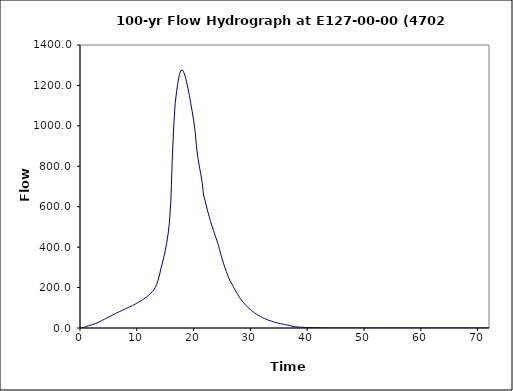
| Category | Series 0 |
|---|---|
| 0.0 | 0 |
| 0.25 | 0.4 |
| 0.5 | 1.7 |
| 0.75 | 4 |
| 1.0 | 6.5 |
| 1.25 | 9 |
| 1.5 | 11.3 |
| 1.75 | 13.4 |
| 2.0 | 15.5 |
| 2.25 | 17.5 |
| 2.5 | 19.7 |
| 2.75 | 22.2 |
| 3.0 | 25.2 |
| 3.25 | 28.4 |
| 3.5 | 31.8 |
| 3.75 | 35.4 |
| 4.0 | 39 |
| 4.25 | 42.7 |
| 4.5 | 46.4 |
| 4.75 | 50 |
| 5.0 | 53.7 |
| 5.25 | 57.3 |
| 5.5 | 60.9 |
| 5.75 | 64.5 |
| 6.0 | 68 |
| 6.25 | 71.5 |
| 6.5 | 75 |
| 6.75 | 78.4 |
| 7.0 | 81.7 |
| 7.25 | 85 |
| 7.5 | 88.3 |
| 7.75 | 91.6 |
| 8.0 | 94.8 |
| 8.25 | 98 |
| 8.5 | 101.1 |
| 8.75 | 104.4 |
| 9.0 | 107.8 |
| 9.25 | 111.3 |
| 9.5 | 115 |
| 9.75 | 118.9 |
| 10.0 | 122.9 |
| 10.25 | 127 |
| 10.5 | 131.1 |
| 10.75 | 135.3 |
| 11.0 | 139.7 |
| 11.25 | 144.3 |
| 11.5 | 149.3 |
| 11.75 | 154.7 |
| 12.0 | 160.4 |
| 12.25 | 166.6 |
| 12.5 | 173.3 |
| 12.75 | 180.6 |
| 13.0 | 188.5 |
| 13.25 | 199.5 |
| 13.5 | 215.8 |
| 13.75 | 236.6 |
| 14.0 | 261.9 |
| 14.25 | 295.5 |
| 14.5 | 321.1 |
| 14.75 | 349.9 |
| 15.0 | 381.8 |
| 15.25 | 418.3 |
| 15.5 | 463.6 |
| 15.75 | 524.8 |
| 16.0 | 632.2 |
| 16.25 | 841.5 |
| 16.5 | 998.6 |
| 16.75 | 1110.4 |
| 17.0 | 1168.7 |
| 17.25 | 1216.4 |
| 17.5 | 1253.5 |
| 17.75 | 1273.8 |
| 18.0 | 1277.1 |
| 18.25 | 1266.5 |
| 18.5 | 1245.8 |
| 18.75 | 1218.3 |
| 19.0 | 1186.6 |
| 19.25 | 1150.8 |
| 19.5 | 1111.8 |
| 19.75 | 1071.4 |
| 20.0 | 1028.5 |
| 20.25 | 977 |
| 20.5 | 900.5 |
| 20.75 | 843 |
| 21.0 | 800.8 |
| 21.25 | 762.9 |
| 21.5 | 721.6 |
| 21.75 | 657.8 |
| 22.0 | 631 |
| 22.25 | 603.4 |
| 22.5 | 575.1 |
| 22.75 | 550.7 |
| 23.0 | 526.3 |
| 23.25 | 503.7 |
| 23.5 | 482.1 |
| 23.75 | 460.6 |
| 24.0 | 440.6 |
| 24.25 | 420.1 |
| 24.5 | 395.2 |
| 24.75 | 368.7 |
| 25.0 | 343.8 |
| 25.25 | 321 |
| 25.5 | 299.6 |
| 25.75 | 279.7 |
| 26.0 | 261.2 |
| 26.25 | 243.9 |
| 26.5 | 228.2 |
| 26.75 | 217.3 |
| 27.0 | 204.9 |
| 27.25 | 191.3 |
| 27.5 | 178.6 |
| 27.75 | 166.7 |
| 28.0 | 155.3 |
| 28.25 | 145.1 |
| 28.5 | 135.6 |
| 28.75 | 126.8 |
| 29.0 | 118.5 |
| 29.25 | 110.9 |
| 29.5 | 103.7 |
| 29.75 | 97 |
| 30.0 | 90.7 |
| 30.25 | 84.8 |
| 30.5 | 79.3 |
| 30.75 | 74.2 |
| 31.0 | 69.4 |
| 31.25 | 64.9 |
| 31.5 | 60.8 |
| 31.75 | 56.8 |
| 32.0 | 53.2 |
| 32.25 | 49.7 |
| 32.5 | 46.5 |
| 32.75 | 43.5 |
| 33.0 | 40.7 |
| 33.25 | 38 |
| 33.5 | 35.5 |
| 33.75 | 33.2 |
| 34.0 | 31 |
| 34.25 | 28.9 |
| 34.5 | 26.9 |
| 34.75 | 25.1 |
| 35.0 | 23.3 |
| 35.25 | 21.7 |
| 35.5 | 20.1 |
| 35.75 | 18.6 |
| 36.0 | 17.2 |
| 36.25 | 15.9 |
| 36.5 | 14.5 |
| 36.75 | 13.1 |
| 37.0 | 11.3 |
| 37.25 | 9.2 |
| 37.5 | 7.6 |
| 37.75 | 6.6 |
| 38.0 | 5.9 |
| 38.25 | 5.3 |
| 38.5 | 4.7 |
| 38.75 | 4.2 |
| 39.0 | 3.8 |
| 39.25 | 3.4 |
| 39.5 | 3 |
| 39.75 | 2.7 |
| 40.0 | 2.4 |
| 40.25 | 2.1 |
| 40.5 | 1.9 |
| 40.75 | 1.7 |
| 41.0 | 1.5 |
| 41.25 | 1.4 |
| 41.5 | 1.2 |
| 41.75 | 1.1 |
| 42.0 | 0.9 |
| 42.25 | 0.8 |
| 42.5 | 0.7 |
| 42.75 | 0.6 |
| 43.0 | 0.5 |
| 43.25 | 0.4 |
| 43.5 | 0.4 |
| 43.75 | 0.3 |
| 44.0 | 0.2 |
| 44.25 | 0.2 |
| 44.5 | 0.1 |
| 44.75 | 0.1 |
| 45.0 | 0 |
| 45.25 | 0 |
| 45.5 | 0 |
| 45.75 | 0 |
| 46.0 | 0 |
| 46.25 | 0 |
| 46.5 | 0 |
| 46.75 | 0 |
| 47.0 | 0 |
| 47.25 | 0 |
| 47.5 | 0 |
| 47.75 | 0 |
| 48.0 | 0 |
| 48.25 | 0 |
| 48.5 | 0 |
| 48.75 | 0 |
| 49.0 | 0 |
| 49.25 | 0 |
| 49.5 | 0 |
| 49.75 | 0 |
| 50.0 | 0 |
| 50.25 | 0 |
| 50.5 | 0 |
| 50.75 | 0 |
| 51.0 | 0 |
| 51.25 | 0 |
| 51.5 | 0 |
| 51.75 | 0 |
| 52.0 | 0 |
| 52.25 | 0 |
| 52.5 | 0 |
| 52.75 | 0 |
| 53.0 | 0 |
| 53.25 | 0 |
| 53.5 | 0 |
| 53.75 | 0 |
| 54.0 | 0 |
| 54.25 | 0 |
| 54.5 | 0 |
| 54.75 | 0 |
| 55.0 | 0 |
| 55.25 | 0 |
| 55.5 | 0 |
| 55.75 | 0 |
| 56.0 | 0 |
| 56.25 | 0 |
| 56.5 | 0 |
| 56.75 | 0 |
| 57.0 | 0 |
| 57.25 | 0 |
| 57.5 | 0 |
| 57.75 | 0 |
| 58.0 | 0 |
| 58.25 | 0 |
| 58.5 | 0 |
| 58.75 | 0 |
| 59.0 | 0 |
| 59.25 | 0 |
| 59.5 | 0 |
| 59.75 | 0 |
| 60.0 | 0 |
| 60.25 | 0 |
| 60.5 | 0 |
| 60.75 | 0 |
| 61.0 | 0 |
| 61.25 | 0 |
| 61.5 | 0 |
| 61.75 | 0 |
| 62.0 | 0 |
| 62.25 | 0 |
| 62.5 | 0 |
| 62.75 | 0 |
| 63.0 | 0 |
| 63.25 | 0 |
| 63.5 | 0 |
| 63.75 | 0 |
| 64.0 | 0 |
| 64.25 | 0 |
| 64.5 | 0 |
| 64.75 | 0 |
| 65.0 | 0 |
| 65.25 | 0 |
| 65.5 | 0 |
| 65.75 | 0 |
| 66.0 | 0 |
| 66.25 | 0 |
| 66.5 | 0 |
| 66.75 | 0 |
| 67.0 | 0 |
| 67.25 | 0 |
| 67.5 | 0 |
| 67.75 | 0 |
| 68.0 | 0 |
| 68.25 | 0 |
| 68.5 | 0 |
| 68.75 | 0 |
| 69.0 | 0 |
| 69.25 | 0 |
| 69.5 | 0 |
| 69.75 | 0 |
| 70.0 | 0 |
| 70.25 | 0 |
| 70.5 | 0 |
| 70.75 | 0 |
| 71.0 | 0 |
| 71.25 | 0 |
| 71.5 | 0 |
| 71.75 | 0 |
| 72.0 | 0 |
| 72.25 | 0 |
| 72.5 | 0 |
| 72.75 | 0 |
| 73.0 | 0 |
| 73.25 | 0 |
| 73.5 | 0 |
| 73.75 | 0 |
| 74.0 | 0 |
| 74.25 | 0 |
| 74.5 | 0 |
| 74.75 | 0 |
| 75.0 | 0 |
| 75.25 | 0 |
| 75.5 | 0 |
| 75.75 | 0 |
| 76.0 | 0 |
| 76.25 | 0 |
| 76.5 | 0 |
| 76.75 | 0 |
| 77.0 | 0 |
| 77.25 | 0 |
| 77.5 | 0 |
| 77.75 | 0 |
| 78.0 | 0 |
| 78.25 | 0 |
| 78.5 | 0 |
| 78.75 | 0 |
| 79.0 | 0 |
| 79.25 | 0 |
| 79.5 | 0 |
| 79.75 | 0 |
| 80.0 | 0 |
| 80.25 | 0 |
| 80.5 | 0 |
| 80.75 | 0 |
| 81.0 | 0 |
| 81.25 | 0 |
| 81.5 | 0 |
| 81.75 | 0 |
| 82.0 | 0 |
| 82.25 | 0 |
| 82.5 | 0 |
| 82.75 | 0 |
| 83.0 | 0 |
| 83.25 | 0 |
| 83.5 | 0 |
| 83.75 | 0 |
| 84.0 | 0 |
| 84.25 | 0 |
| 84.5 | 0 |
| 84.75 | 0 |
| 85.0 | 0 |
| 85.25 | 0 |
| 85.5 | 0 |
| 85.75 | 0 |
| 86.0 | 0 |
| 86.25 | 0 |
| 86.5 | 0 |
| 86.75 | 0 |
| 87.0 | 0 |
| 87.25 | 0 |
| 87.5 | 0 |
| 87.75 | 0 |
| 88.0 | 0 |
| 88.25 | 0 |
| 88.5 | 0 |
| 88.75 | 0 |
| 89.0 | 0 |
| 89.25 | 0 |
| 89.5 | 0 |
| 89.75 | 0 |
| 90.0 | 0 |
| 90.25 | 0 |
| 90.5 | 0 |
| 90.75 | 0 |
| 91.0 | 0 |
| 91.25 | 0 |
| 91.5 | 0 |
| 91.75 | 0 |
| 92.0 | 0 |
| 92.25 | 0 |
| 92.5 | 0 |
| 92.75 | 0 |
| 93.0 | 0 |
| 93.25 | 0 |
| 93.5 | 0 |
| 93.75 | 0 |
| 94.0 | 0 |
| 94.25 | 0 |
| 94.5 | 0 |
| 94.75 | 0 |
| 95.0 | 0 |
| 95.25 | 0 |
| 95.5 | 0 |
| 95.75 | 0 |
| 96.0 | 0 |
| 96.25 | 0 |
| 96.5 | 0 |
| 96.75 | 0 |
| 97.0 | 0 |
| 97.25 | 0 |
| 97.5 | 0 |
| 97.75 | 0 |
| 98.0 | 0 |
| 98.25 | 0 |
| 98.5 | 0 |
| 98.75 | 0 |
| 99.0 | 0 |
| 99.25 | 0 |
| 99.5 | 0 |
| 99.75 | 0 |
| 100.0 | 0 |
| 100.25 | 0 |
| 100.5 | 0 |
| 100.75 | 0 |
| 101.0 | 0 |
| 101.25 | 0 |
| 101.5 | 0 |
| 101.75 | 0 |
| 102.0 | 0 |
| 102.25 | 0 |
| 102.5 | 0 |
| 102.75 | 0 |
| 103.0 | 0 |
| 103.25 | 0 |
| 103.5 | 0 |
| 103.75 | 0 |
| 104.0 | 0 |
| 104.25 | 0 |
| 104.5 | 0 |
| 104.75 | 0 |
| 105.0 | 0 |
| 105.25 | 0 |
| 105.5 | 0 |
| 105.75 | 0 |
| 106.0 | 0 |
| 106.25 | 0 |
| 106.5 | 0 |
| 106.75 | 0 |
| 107.0 | 0 |
| 107.25 | 0 |
| 107.5 | 0 |
| 107.75 | 0 |
| 108.0 | 0 |
| 108.25 | 0 |
| 108.5 | 0 |
| 108.75 | 0 |
| 109.0 | 0 |
| 109.25 | 0 |
| 109.5 | 0 |
| 109.75 | 0 |
| 110.0 | 0 |
| 110.25 | 0 |
| 110.5 | 0 |
| 110.75 | 0 |
| 111.0 | 0 |
| 111.25 | 0 |
| 111.5 | 0 |
| 111.75 | 0 |
| 112.0 | 0 |
| 112.25 | 0 |
| 112.5 | 0 |
| 112.75 | 0 |
| 113.0 | 0 |
| 113.25 | 0 |
| 113.5 | 0 |
| 113.75 | 0 |
| 114.0 | 0 |
| 114.25 | 0 |
| 114.5 | 0 |
| 114.75 | 0 |
| 115.0 | 0 |
| 115.25 | 0 |
| 115.5 | 0 |
| 115.75 | 0 |
| 116.0 | 0 |
| 116.25 | 0 |
| 116.5 | 0 |
| 116.75 | 0 |
| 117.0 | 0 |
| 117.25 | 0 |
| 117.5 | 0 |
| 117.75 | 0 |
| 118.0 | 0 |
| 118.25 | 0 |
| 118.5 | 0 |
| 118.75 | 0 |
| 119.0 | 0 |
| 119.25 | 0 |
| 119.5 | 0 |
| 119.75 | 0 |
| 120.0 | 0 |
| 120.25 | 0 |
| 120.5 | 0 |
| 120.75 | 0 |
| 121.0 | 0 |
| 121.25 | 0 |
| 121.5 | 0 |
| 121.75 | 0 |
| 122.0 | 0 |
| 122.25 | 0 |
| 122.5 | 0 |
| 122.75 | 0 |
| 123.0 | 0 |
| 123.25 | 0 |
| 123.5 | 0 |
| 123.75 | 0 |
| 124.0 | 0 |
| 124.25 | 0 |
| 124.5 | 0 |
| 124.75 | 0 |
| 125.0 | 0 |
| 125.25 | 0 |
| 125.5 | 0 |
| 125.75 | 0 |
| 126.0 | 0 |
| 126.25 | 0 |
| 126.5 | 0 |
| 126.75 | 0 |
| 127.0 | 0 |
| 127.25 | 0 |
| 127.5 | 0 |
| 127.75 | 0 |
| 128.0 | 0 |
| 128.25 | 0 |
| 128.5 | 0 |
| 128.75 | 0 |
| 129.0 | 0 |
| 129.25 | 0 |
| 129.5 | 0 |
| 129.75 | 0 |
| 130.0 | 0 |
| 130.25 | 0 |
| 130.5 | 0 |
| 130.75 | 0 |
| 131.0 | 0 |
| 131.25 | 0 |
| 131.5 | 0 |
| 131.75 | 0 |
| 132.0 | 0 |
| 132.25 | 0 |
| 132.5 | 0 |
| 132.75 | 0 |
| 133.0 | 0 |
| 133.25 | 0 |
| 133.5 | 0 |
| 133.75 | 0 |
| 134.0 | 0 |
| 134.25 | 0 |
| 134.5 | 0 |
| 134.75 | 0 |
| 135.0 | 0 |
| 135.25 | 0 |
| 135.5 | 0 |
| 135.75 | 0 |
| 136.0 | 0 |
| 136.25 | 0 |
| 136.5 | 0 |
| 136.75 | 0 |
| 137.0 | 0 |
| 137.25 | 0 |
| 137.5 | 0 |
| 137.75 | 0 |
| 138.0 | 0 |
| 138.25 | 0 |
| 138.5 | 0 |
| 138.75 | 0 |
| 139.0 | 0 |
| 139.25 | 0 |
| 139.5 | 0 |
| 139.75 | 0 |
| 140.0 | 0 |
| 140.25 | 0 |
| 140.5 | 0 |
| 140.75 | 0 |
| 141.0 | 0 |
| 141.25 | 0 |
| 141.5 | 0 |
| 141.75 | 0 |
| 142.0 | 0 |
| 142.25 | 0 |
| 142.5 | 0 |
| 142.75 | 0 |
| 143.0 | 0 |
| 143.25 | 0 |
| 143.5 | 0 |
| 143.75 | 0 |
| 144.0 | 0 |
| 144.25 | 0 |
| 144.5 | 0 |
| 144.75 | 0 |
| 145.0 | 0 |
| 145.25 | 0 |
| 145.5 | 0 |
| 145.75 | 0 |
| 146.0 | 0 |
| 146.25 | 0 |
| 146.5 | 0 |
| 146.75 | 0 |
| 147.0 | 0 |
| 147.25 | 0 |
| 147.5 | 0 |
| 147.75 | 0 |
| 148.0 | 0 |
| 148.25 | 0 |
| 148.5 | 0 |
| 148.75 | 0 |
| 149.0 | 0 |
| 149.25 | 0 |
| 149.5 | 0 |
| 149.75 | 0 |
| 150.0 | 0 |
| 150.25 | 0 |
| 150.5 | 0 |
| 150.75 | 0 |
| 151.0 | 0 |
| 151.25 | 0 |
| 151.5 | 0 |
| 151.75 | 0 |
| 152.0 | 0 |
| 152.25 | 0 |
| 152.5 | 0 |
| 152.75 | 0 |
| 153.0 | 0 |
| 153.25 | 0 |
| 153.5 | 0 |
| 153.75 | 0 |
| 154.0 | 0 |
| 154.25 | 0 |
| 154.5 | 0 |
| 154.75 | 0 |
| 155.0 | 0 |
| 155.25 | 0 |
| 155.5 | 0 |
| 155.75 | 0 |
| 156.0 | 0 |
| 156.25 | 0 |
| 156.5 | 0 |
| 156.75 | 0 |
| 157.0 | 0 |
| 157.25 | 0 |
| 157.5 | 0 |
| 157.75 | 0 |
| 158.0 | 0 |
| 158.25 | 0 |
| 158.5 | 0 |
| 158.75 | 0 |
| 159.0 | 0 |
| 159.25 | 0 |
| 159.5 | 0 |
| 159.75 | 0 |
| 160.0 | 0 |
| 160.25 | 0 |
| 160.5 | 0 |
| 160.75 | 0 |
| 161.0 | 0 |
| 161.25 | 0 |
| 161.5 | 0 |
| 161.75 | 0 |
| 162.0 | 0 |
| 162.25 | 0 |
| 162.5 | 0 |
| 162.75 | 0 |
| 163.0 | 0 |
| 163.25 | 0 |
| 163.5 | 0 |
| 163.75 | 0 |
| 164.0 | 0 |
| 164.25 | 0 |
| 164.5 | 0 |
| 164.75 | 0 |
| 165.0 | 0 |
| 165.25 | 0 |
| 165.5 | 0 |
| 165.75 | 0 |
| 166.0 | 0 |
| 166.25 | 0 |
| 166.5 | 0 |
| 166.75 | 0 |
| 167.0 | 0 |
| 167.25 | 0 |
| 167.5 | 0 |
| 167.75 | 0 |
| 168.0 | 0 |
| 168.25 | 0 |
| 168.5 | 0 |
| 168.75 | 0 |
| 169.0 | 0 |
| 169.25 | 0 |
| 169.5 | 0 |
| 169.75 | 0 |
| 170.0 | 0 |
| 170.25 | 0 |
| 170.5 | 0 |
| 170.75 | 0 |
| 171.0 | 0 |
| 171.25 | 0 |
| 171.5 | 0 |
| 171.75 | 0 |
| 172.0 | 0 |
| 172.25 | 0 |
| 172.5 | 0 |
| 172.75 | 0 |
| 173.0 | 0 |
| 173.25 | 0 |
| 173.5 | 0 |
| 173.75 | 0 |
| 174.0 | 0 |
| 174.25 | 0 |
| 174.5 | 0 |
| 174.75 | 0 |
| 175.0 | 0 |
| 175.25 | 0 |
| 175.5 | 0 |
| 175.75 | 0 |
| 176.0 | 0 |
| 176.25 | 0 |
| 176.5 | 0 |
| 176.75 | 0 |
| 177.0 | 0 |
| 177.25 | 0 |
| 177.5 | 0 |
| 177.75 | 0 |
| 178.0 | 0 |
| 178.25 | 0 |
| 178.5 | 0 |
| 178.75 | 0 |
| 179.0 | 0 |
| 179.25 | 0 |
| 179.5 | 0 |
| 179.75 | 0 |
| 180.0 | 0 |
| 180.25 | 0 |
| 180.5 | 0 |
| 180.75 | 0 |
| 181.0 | 0 |
| 181.25 | 0 |
| 181.5 | 0 |
| 181.75 | 0 |
| 182.0 | 0 |
| 182.25 | 0 |
| 182.5 | 0 |
| 182.75 | 0 |
| 183.0 | 0 |
| 183.25 | 0 |
| 183.5 | 0 |
| 183.75 | 0 |
| 184.0 | 0 |
| 184.25 | 0 |
| 184.5 | 0 |
| 184.75 | 0 |
| 185.0 | 0 |
| 185.25 | 0 |
| 185.5 | 0 |
| 185.75 | 0 |
| 186.0 | 0 |
| 186.25 | 0 |
| 186.5 | 0 |
| 186.75 | 0 |
| 187.0 | 0 |
| 187.25 | 0 |
| 187.5 | 0 |
| 187.75 | 0 |
| 188.0 | 0 |
| 188.25 | 0 |
| 188.5 | 0 |
| 188.75 | 0 |
| 189.0 | 0 |
| 189.25 | 0 |
| 189.5 | 0 |
| 189.75 | 0 |
| 190.0 | 0 |
| 190.25 | 0 |
| 190.5 | 0 |
| 190.75 | 0 |
| 191.0 | 0 |
| 191.25 | 0 |
| 191.5 | 0 |
| 191.75 | 0 |